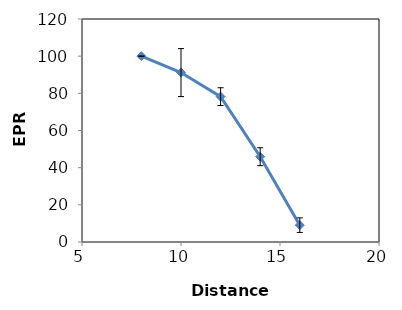
| Category | % |
|---|---|
| 8.0 | 100 |
| 10.0 | 91.17 |
| 12.0 | 78.23 |
| 14.0 | 45.9 |
| 16.0 | 9.07 |